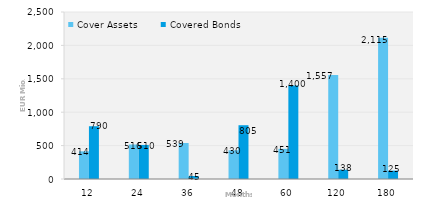
| Category | Cover Assets | Covered Bonds |
|---|---|---|
| 12.0 | 414.197 | 790 |
| 24.0 | 515.895 | 510 |
| 36.0 | 539.226 | 45 |
| 48.0 | 429.952 | 805 |
| 60.0 | 451.286 | 1400 |
| 120.0 | 1557.231 | 138 |
| 180.0 | 2114.62 | 125 |